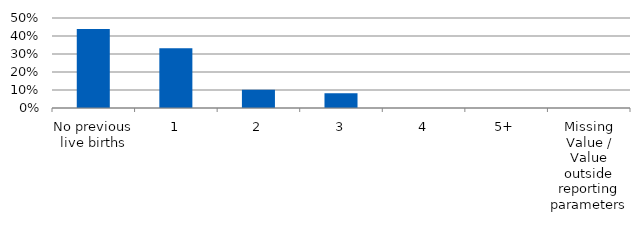
| Category | Total |
|---|---|
| No previous live births | 0.439 |
| 1 | 0.332 |
| 2 | 0.102 |
| 3 | 0.082 |
| 4 | 0 |
| 5+ | 0 |
| Missing Value / Value outside reporting parameters | 0 |